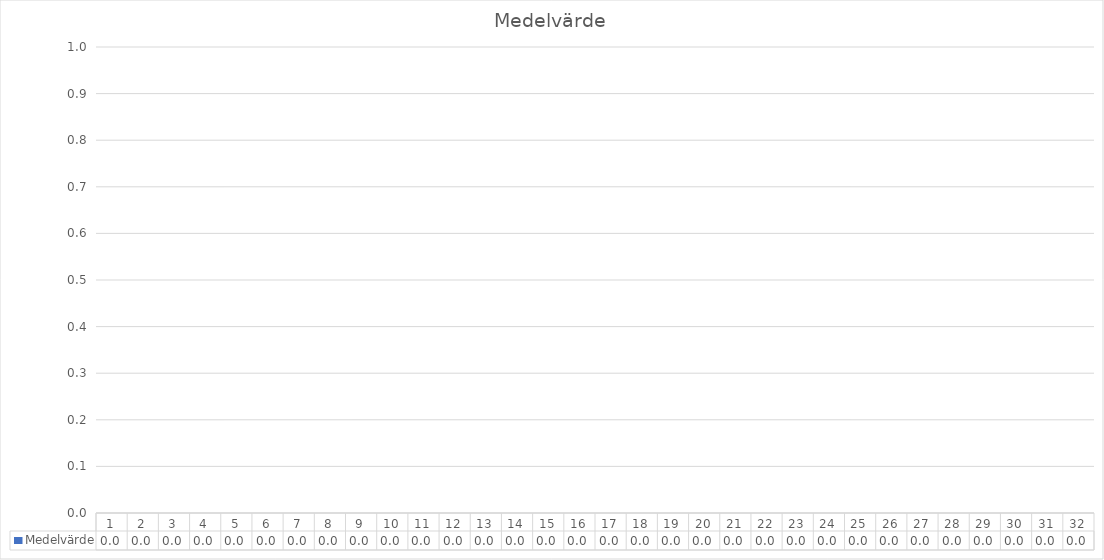
| Category | Medelvärde |
|---|---|
| 0 | 0 |
| 1 | 0 |
| 2 | 0 |
| 3 | 0 |
| 4 | 0 |
| 5 | 0 |
| 6 | 0 |
| 7 | 0 |
| 8 | 0 |
| 9 | 0 |
| 10 | 0 |
| 11 | 0 |
| 12 | 0 |
| 13 | 0 |
| 14 | 0 |
| 15 | 0 |
| 16 | 0 |
| 17 | 0 |
| 18 | 0 |
| 19 | 0 |
| 20 | 0 |
| 21 | 0 |
| 22 | 0 |
| 23 | 0 |
| 24 | 0 |
| 25 | 0 |
| 26 | 0 |
| 27 | 0 |
| 28 | 0 |
| 29 | 0 |
| 30 | 0 |
| 31 | 0 |